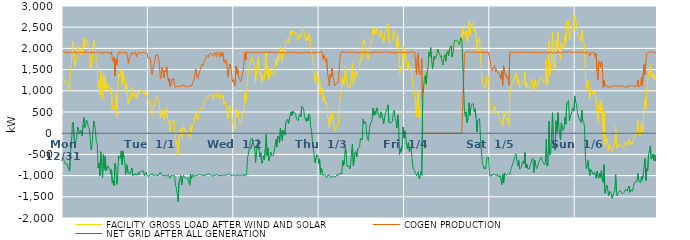
| Category | FACILITY GROSS LOAD AFTER WIND AND SOLAR | COGEN PRODUCTION | NET GRID AFTER ALL GENERATION |
|---|---|---|---|
|  Mon  12/31 | 1329 | 1917 | -588 |
|  Mon  12/31 | 1219 | 1903 | -684 |
|  Mon  12/31 | 1180 | 1905 | -725 |
|  Mon  12/31 | 1200 | 1903 | -703 |
|  Mon  12/31 | 1185 | 1904 | -719 |
|  Mon  12/31 | 1177 | 1906 | -729 |
|  Mon  12/31 | 1044 | 1895 | -851 |
|  Mon  12/31 | 1004 | 1900 | -896 |
|  Mon  12/31 | 1483 | 1908 | -425 |
|  Mon  12/31 | 1666 | 1898 | -232 |
|  Mon  12/31 | 2110 | 1899 | 211 |
|  Mon  12/31 | 2169 | 1907 | 262 |
|  Mon  12/31 | 1770 | 1909 | -139 |
|  Mon  12/31 | 1578 | 1900 | -322 |
|  Mon  12/31 | 1738 | 1912 | -174 |
|  Mon  12/31 | 1782 | 1881 | -99 |
|  Mon  12/31 | 2046 | 1904 | 142 |
|  Mon  12/31 | 1999 | 1904 | 95 |
|  Mon  12/31 | 1878 | 1896 | -18 |
|  Mon  12/31 | 1949 | 1912 | 37 |
|  Mon  12/31 | 1976 | 1906 | 70 |
|  Mon  12/31 | 1841 | 1907 | -66 |
|  Mon  12/31 | 2080 | 1887 | 193 |
|  Mon  12/31 | 2268 | 1894 | 374 |
|  Mon  12/31 | 2028 | 1894 | 134 |
|  Mon  12/31 | 2127 | 1919 | 208 |
|  Mon  12/31 | 2216 | 1905 | 311 |
|  Mon  12/31 | 2159 | 1895 | 264 |
|  Mon  12/31 | 2035 | 1897 | 138 |
|  Mon  12/31 | 2008 | 1903 | 105 |
|  Mon  12/31 | 1819 | 1903 | -84 |
|  Mon  12/31 | 1501 | 1893 | -392 |
|  Mon  12/31 | 1616 | 1907 | -291 |
|  Mon  12/31 | 1901 | 1907 | -6 |
|  Mon  12/31 | 2199 | 1912 | 287 |
|  Mon  12/31 | 2105 | 1898 | 207 |
|  Mon  12/31 | 1959 | 1913 | 46 |
|  Mon  12/31 | 1715 | 1922 | -207 |
|  Mon  12/31 | 1673 | 1907 | -234 |
|  Mon  12/31 | 1083 | 1899 | -816 |
|  Mon  12/31 | 1196 | 1901 | -705 |
|  Mon  12/31 | 888 | 1887 | -999 |
|  Mon  12/31 | 1469 | 1907 | -438 |
|  Mon  12/31 | 1186 | 1915 | -729 |
|  Mon  12/31 | 814 | 1863 | -1049 |
|  Mon  12/31 | 1413 | 1911 | -498 |
|  Mon  12/31 | 1053 | 1905 | -852 |
|  Mon  12/31 | 1358 | 1904 | -546 |
|  Mon  12/31 | 1014 | 1904 | -890 |
|  Mon  12/31 | 994 | 1890 | -896 |
|  Mon  12/31 | 1144 | 1914 | -770 |
|  Mon  12/31 | 1136 | 1912 | -776 |
|  Mon  12/31 | 1025 | 1860 | -835 |
|  Mon  12/31 | 926 | 1890 | -964 |
|  Mon  12/31 | 1075 | 1921 | -846 |
|  Mon  12/31 | 573 | 1751 | -1178 |
|  Mon  12/31 | 572 | 1697 | -1125 |
|  Mon  12/31 | 558 | 1800 | -1242 |
|  Mon  12/31 | 632 | 1350 | -718 |
|  Mon  12/31 | 915 | 1744 | -829 |
|  Mon  12/31 | 399 | 1605 | -1206 |
|  Mon  12/31 | 821 | 1829 | -1008 |
|  Mon  12/31 | 1382 | 1916 | -534 |
|  Mon  12/31 | 1328 | 1892 | -564 |
|  Mon  12/31 | 1313 | 1912 | -599 |
|  Mon  12/31 | 1495 | 1913 | -418 |
|  Mon  12/31 | 1160 | 1899 | -739 |
|  Mon  12/31 | 1472 | 1890 | -418 |
|  Mon  12/31 | 1327 | 1909 | -582 |
|  Mon  12/31 | 1184 | 1903 | -719 |
|  Mon  12/31 | 944 | 1916 | -972 |
|  Mon  12/31 | 1187 | 1913 | -726 |
|  Mon  12/31 | 1193 | 1902 | -709 |
|  Mon  12/31 | 697 | 1645 | -948 |
|  Mon  12/31 | 809 | 1765 | -956 |
|  Mon  12/31 | 783 | 1752 | -969 |
|  Mon  12/31 | 917 | 1864 | -947 |
|  Mon  12/31 | 1078 | 1905 | -827 |
|  Mon  12/31 | 857 | 1856 | -999 |
|  Mon  12/31 | 933 | 1890 | -957 |
|  Mon  12/31 | 881 | 1870 | -989 |
|  Mon  12/31 | 953 | 1908 | -955 |
|  Mon  12/31 | 808 | 1802 | -994 |
|  Mon  12/31 | 891 | 1871 | -980 |
|  Mon  12/31 | 972 | 1901 | -929 |
|  Mon  12/31 | 932 | 1916 | -984 |
|  Mon  12/31 | 982 | 1889 | -907 |
|  Mon  12/31 | 1032 | 1912 | -880 |
|  Mon  12/31 | 1043 | 1901 | -858 |
|  Mon  12/31 | 988 | 1897 | -909 |
|  Mon  12/31 | 1020 | 1901 | -881 |
|  Mon  12/31 | 900 | 1900 | -1000 |
|  Mon  12/31 | 928 | 1893 | -965 |
|  Mon  12/31 | 980 | 1905 | -925 |
|  Mon  12/31 | 886 | 1891 | -1005 |
|  Mon  12/31 | 780 | 1775 | -995 |
|  Tue  1/1 | 761 | 1778 | -1017 |
|  Tue  1/1 | 789 | 1785 | -996 |
|  Tue  1/1 | 765 | 1733 | -968 |
|  Tue  1/1 | 448 | 1412 | -964 |
|  Tue  1/1 | 423 | 1383 | -960 |
|  Tue  1/1 | 561 | 1561 | -1000 |
|  Tue  1/1 | 658 | 1645 | -987 |
|  Tue  1/1 | 748 | 1727 | -979 |
|  Tue  1/1 | 856 | 1850 | -994 |
|  Tue  1/1 | 855 | 1851 | -996 |
|  Tue  1/1 | 848 | 1838 | -990 |
|  Tue  1/1 | 768 | 1762 | -994 |
|  Tue  1/1 | 630 | 1610 | -980 |
|  Tue  1/1 | 360 | 1279 | -919 |
|  Tue  1/1 | 353 | 1331 | -978 |
|  Tue  1/1 | 539 | 1550 | -1011 |
|  Tue  1/1 | 439 | 1451 | -1012 |
|  Tue  1/1 | 318 | 1307 | -989 |
|  Tue  1/1 | 481 | 1479 | -998 |
|  Tue  1/1 | 440 | 1444 | -1004 |
|  Tue  1/1 | 589 | 1573 | -984 |
|  Tue  1/1 | 358 | 1366 | -1008 |
|  Tue  1/1 | 230 | 1212 | -982 |
|  Tue  1/1 | 322 | 1299 | -977 |
|  Tue  1/1 | 38 | 1104 | -1066 |
|  Tue  1/1 | 185 | 1182 | -997 |
|  Tue  1/1 | 281 | 1276 | -995 |
|  Tue  1/1 | 245 | 1248 | -1003 |
|  Tue  1/1 | 316 | 1296 | -980 |
|  Tue  1/1 | 134 | 1135 | -1001 |
|  Tue  1/1 | -154 | 1083 | -1237 |
|  Tue  1/1 | -196 | 1099 | -1295 |
|  Tue  1/1 | -325 | 1107 | -1432 |
|  Tue  1/1 | -514 | 1103 | -1617 |
|  Tue  1/1 | -46 | 1109 | -1155 |
|  Tue  1/1 | 39 | 1113 | -1074 |
|  Tue  1/1 | 113 | 1111 | -998 |
|  Tue  1/1 | -123 | 1099 | -1222 |
|  Tue  1/1 | 55 | 1117 | -1062 |
|  Tue  1/1 | 165 | 1156 | -991 |
|  Tue  1/1 | 63 | 1107 | -1044 |
|  Tue  1/1 | 70 | 1112 | -1042 |
|  Tue  1/1 | 42 | 1109 | -1067 |
|  Tue  1/1 | 40 | 1111 | -1071 |
|  Tue  1/1 | 20 | 1079 | -1059 |
|  Tue  1/1 | -57 | 1095 | -1152 |
|  Tue  1/1 | -108 | 1119 | -1227 |
|  Tue  1/1 | 152 | 1123 | -971 |
|  Tue  1/1 | 43 | 1115 | -1072 |
|  Tue  1/1 | 165 | 1165 | -1000 |
|  Tue  1/1 | 210 | 1181 | -971 |
|  Tue  1/1 | 254 | 1277 | -1023 |
|  Tue  1/1 | 261 | 1282 | -1021 |
|  Tue  1/1 | 517 | 1508 | -991 |
|  Tue  1/1 | 357 | 1352 | -995 |
|  Tue  1/1 | 294 | 1286 | -992 |
|  Tue  1/1 | 370 | 1343 | -973 |
|  Tue  1/1 | 487 | 1459 | -972 |
|  Tue  1/1 | 539 | 1508 | -969 |
|  Tue  1/1 | 617 | 1599 | -982 |
|  Tue  1/1 | 629 | 1625 | -996 |
|  Tue  1/1 | 577 | 1587 | -1010 |
|  Tue  1/1 | 704 | 1685 | -981 |
|  Tue  1/1 | 769 | 1734 | -965 |
|  Tue  1/1 | 767 | 1759 | -992 |
|  Tue  1/1 | 851 | 1838 | -987 |
|  Tue  1/1 | 845 | 1818 | -973 |
|  Tue  1/1 | 853 | 1793 | -940 |
|  Tue  1/1 | 894 | 1869 | -975 |
|  Tue  1/1 | 893 | 1886 | -993 |
|  Tue  1/1 | 899 | 1883 | -984 |
|  Tue  1/1 | 866 | 1853 | -987 |
|  Tue  1/1 | 789 | 1813 | -1024 |
|  Tue  1/1 | 866 | 1849 | -983 |
|  Tue  1/1 | 931 | 1910 | -979 |
|  Tue  1/1 | 919 | 1915 | -996 |
|  Tue  1/1 | 830 | 1802 | -972 |
|  Tue  1/1 | 948 | 1918 | -970 |
|  Tue  1/1 | 881 | 1882 | -1001 |
|  Tue  1/1 | 883 | 1862 | -979 |
|  Tue  1/1 | 797 | 1793 | -996 |
|  Tue  1/1 | 924 | 1902 | -978 |
|  Tue  1/1 | 832 | 1827 | -995 |
|  Tue  1/1 | 903 | 1900 | -997 |
|  Tue  1/1 | 896 | 1887 | -991 |
|  Tue  1/1 | 682 | 1656 | -974 |
|  Tue  1/1 | 681 | 1672 | -991 |
|  Tue  1/1 | 723 | 1723 | -1000 |
|  Tue  1/1 | 567 | 1554 | -987 |
|  Tue  1/1 | 332 | 1336 | -1004 |
|  Tue  1/1 | 547 | 1505 | -958 |
|  Tue  1/1 | 657 | 1631 | -974 |
|  Tue  1/1 | 544 | 1546 | -1002 |
|  Tue  1/1 | 463 | 1469 | -1006 |
|  Tue  1/1 | 228 | 1215 | -987 |
|  Tue  1/1 | 258 | 1261 | -1003 |
|  Wed  1/2 | 184 | 1171 | -987 |
|  Wed  1/2 | 104 | 1117 | -1013 |
|  Wed  1/2 | 576 | 1576 | -1000 |
|  Wed  1/2 | 404 | 1401 | -997 |
|  Wed  1/2 | 529 | 1511 | -982 |
|  Wed  1/2 | 357 | 1335 | -978 |
|  Wed  1/2 | 282 | 1293 | -1011 |
|  Wed  1/2 | 214 | 1214 | -1000 |
|  Wed  1/2 | 264 | 1258 | -994 |
|  Wed  1/2 | 398 | 1379 | -981 |
|  Wed  1/2 | 486 | 1463 | -977 |
|  Wed  1/2 | 630 | 1640 | -1010 |
|  Wed  1/2 | 937 | 1907 | -970 |
|  Wed  1/2 | 727 | 1725 | -998 |
|  Wed  1/2 | 971 | 1914 | -943 |
|  Wed  1/2 | 1314 | 1895 | -581 |
|  Wed  1/2 | 1426 | 1916 | -490 |
|  Wed  1/2 | 1560 | 1896 | -336 |
|  Wed  1/2 | 1704 | 1903 | -199 |
|  Wed  1/2 | 1760 | 1901 | -141 |
|  Wed  1/2 | 1794 | 1906 | -112 |
|  Wed  1/2 | 1746 | 1881 | -135 |
|  Wed  1/2 | 1629 | 1908 | -279 |
|  Wed  1/2 | 1574 | 1895 | -321 |
|  Wed  1/2 | 1201 | 1901 | -700 |
|  Wed  1/2 | 1468 | 1908 | -440 |
|  Wed  1/2 | 1617 | 1905 | -288 |
|  Wed  1/2 | 1784 | 1921 | -137 |
|  Wed  1/2 | 1510 | 1909 | -399 |
|  Wed  1/2 | 1372 | 1929 | -557 |
|  Wed  1/2 | 1423 | 1886 | -463 |
|  Wed  1/2 | 1210 | 1919 | -709 |
|  Wed  1/2 | 1226 | 1908 | -682 |
|  Wed  1/2 | 1370 | 1901 | -531 |
|  Wed  1/2 | 1286 | 1906 | -620 |
|  Wed  1/2 | 1546 | 1912 | -366 |
|  Wed  1/2 | 1886 | 1918 | -32 |
|  Wed  1/2 | 1380 | 1905 | -525 |
|  Wed  1/2 | 1558 | 1908 | -350 |
|  Wed  1/2 | 1255 | 1903 | -648 |
|  Wed  1/2 | 1321 | 1898 | -577 |
|  Wed  1/2 | 1476 | 1920 | -444 |
|  Wed  1/2 | 1396 | 1912 | -516 |
|  Wed  1/2 | 1389 | 1896 | -507 |
|  Wed  1/2 | 1379 | 1904 | -525 |
|  Wed  1/2 | 1464 | 1900 | -436 |
|  Wed  1/2 | 1607 | 1905 | -298 |
|  Wed  1/2 | 1749 | 1895 | -146 |
|  Wed  1/2 | 1584 | 1912 | -328 |
|  Wed  1/2 | 1843 | 1909 | -66 |
|  Wed  1/2 | 1812 | 1920 | -108 |
|  Wed  1/2 | 1685 | 1910 | -225 |
|  Wed  1/2 | 2034 | 1918 | 116 |
|  Wed  1/2 | 1886 | 1904 | -18 |
|  Wed  1/2 | 1713 | 1886 | -173 |
|  Wed  1/2 | 1973 | 1909 | 64 |
|  Wed  1/2 | 1954 | 1902 | 52 |
|  Wed  1/2 | 1858 | 1903 | -45 |
|  Wed  1/2 | 2124 | 1872 | 252 |
|  Wed  1/2 | 2170 | 1911 | 259 |
|  Wed  1/2 | 2229 | 1896 | 333 |
|  Wed  1/2 | 2140 | 1912 | 228 |
|  Wed  1/2 | 2239 | 1913 | 326 |
|  Wed  1/2 | 2247 | 1911 | 336 |
|  Wed  1/2 | 2403 | 1898 | 505 |
|  Wed  1/2 | 2318 | 1897 | 421 |
|  Wed  1/2 | 2425 | 1903 | 522 |
|  Wed  1/2 | 2386 | 1910 | 476 |
|  Wed  1/2 | 2377 | 1892 | 485 |
|  Wed  1/2 | 2370 | 1899 | 471 |
|  Wed  1/2 | 2237 | 1903 | 334 |
|  Wed  1/2 | 2223 | 1894 | 329 |
|  Wed  1/2 | 2201 | 1904 | 297 |
|  Wed  1/2 | 2326 | 1905 | 421 |
|  Wed  1/2 | 2349 | 1903 | 446 |
|  Wed  1/2 | 2277 | 1891 | 386 |
|  Wed  1/2 | 2521 | 1894 | 627 |
|  Wed  1/2 | 2536 | 1906 | 630 |
|  Wed  1/2 | 2470 | 1882 | 588 |
|  Wed  1/2 | 2316 | 1911 | 405 |
|  Wed  1/2 | 2319 | 1918 | 401 |
|  Wed  1/2 | 2184 | 1907 | 277 |
|  Wed  1/2 | 2278 | 1912 | 366 |
|  Wed  1/2 | 2191 | 1903 | 288 |
|  Wed  1/2 | 2354 | 1906 | 448 |
|  Wed  1/2 | 2318 | 1902 | 416 |
|  Wed  1/2 | 2046 | 1900 | 146 |
|  Wed  1/2 | 1939 | 1890 | 49 |
|  Wed  1/2 | 1716 | 1904 | -188 |
|  Wed  1/2 | 1741 | 1908 | -167 |
|  Wed  1/2 | 1367 | 1906 | -539 |
|  Wed  1/2 | 1189 | 1889 | -700 |
|  Wed  1/2 | 1300 | 1887 | -587 |
|  Wed  1/2 | 1415 | 1915 | -500 |
|  Wed  1/2 | 1390 | 1914 | -524 |
|  Wed  1/2 | 1184 | 1899 | -715 |
|  Thu  1/3 | 1302 | 1908 | -606 |
|  Thu  1/3 | 945 | 1914 | -969 |
|  Thu  1/3 | 1084 | 1909 | -825 |
|  Thu  1/3 | 1027 | 1913 | -886 |
|  Thu  1/3 | 751 | 1749 | -998 |
|  Thu  1/3 | 864 | 1834 | -970 |
|  Thu  1/3 | 780 | 1743 | -963 |
|  Thu  1/3 | 676 | 1680 | -1004 |
|  Thu  1/3 | 716 | 1762 | -1046 |
|  Thu  1/3 | 412 | 1406 | -994 |
|  Thu  1/3 | 320 | 1293 | -973 |
|  Thu  1/3 | 135 | 1120 | -985 |
|  Thu  1/3 | 425 | 1388 | -963 |
|  Thu  1/3 | 278 | 1321 | -1043 |
|  Thu  1/3 | 504 | 1532 | -1028 |
|  Thu  1/3 | 364 | 1368 | -1004 |
|  Thu  1/3 | 238 | 1237 | -999 |
|  Thu  1/3 | 80 | 1115 | -1035 |
|  Thu  1/3 | 52 | 1106 | -1054 |
|  Thu  1/3 | 173 | 1182 | -1009 |
|  Thu  1/3 | 196 | 1166 | -970 |
|  Thu  1/3 | 186 | 1185 | -999 |
|  Thu  1/3 | 499 | 1475 | -976 |
|  Thu  1/3 | 825 | 1770 | -945 |
|  Thu  1/3 | 941 | 1898 | -957 |
|  Thu  1/3 | 935 | 1892 | -957 |
|  Thu  1/3 | 1296 | 1925 | -629 |
|  Thu  1/3 | 1141 | 1908 | -767 |
|  Thu  1/3 | 1247 | 1912 | -665 |
|  Thu  1/3 | 1586 | 1902 | -316 |
|  Thu  1/3 | 1409 | 1895 | -486 |
|  Thu  1/3 | 1115 | 1897 | -782 |
|  Thu  1/3 | 1146 | 1917 | -771 |
|  Thu  1/3 | 1151 | 1918 | -767 |
|  Thu  1/3 | 1064 | 1907 | -843 |
|  Thu  1/3 | 1149 | 1901 | -752 |
|  Thu  1/3 | 1464 | 1905 | -441 |
|  Thu  1/3 | 1657 | 1911 | -254 |
|  Thu  1/3 | 1145 | 1914 | -769 |
|  Thu  1/3 | 1124 | 1904 | -780 |
|  Thu  1/3 | 1449 | 1905 | -456 |
|  Thu  1/3 | 1470 | 1900 | -430 |
|  Thu  1/3 | 1344 | 1901 | -557 |
|  Thu  1/3 | 1524 | 1893 | -369 |
|  Thu  1/3 | 1513 | 1893 | -380 |
|  Thu  1/3 | 1566 | 1886 | -320 |
|  Thu  1/3 | 1793 | 1910 | -117 |
|  Thu  1/3 | 1800 | 1897 | -97 |
|  Thu  1/3 | 1745 | 1907 | -162 |
|  Thu  1/3 | 2224 | 1891 | 333 |
|  Thu  1/3 | 2125 | 1900 | 225 |
|  Thu  1/3 | 2176 | 1900 | 276 |
|  Thu  1/3 | 2164 | 1919 | 245 |
|  Thu  1/3 | 1880 | 1902 | -22 |
|  Thu  1/3 | 1769 | 1903 | -134 |
|  Thu  1/3 | 1734 | 1908 | -174 |
|  Thu  1/3 | 1988 | 1910 | 78 |
|  Thu  1/3 | 2094 | 1877 | 217 |
|  Thu  1/3 | 2125 | 1893 | 232 |
|  Thu  1/3 | 2213 | 1911 | 302 |
|  Thu  1/3 | 2487 | 1894 | 593 |
|  Thu  1/3 | 2329 | 1909 | 420 |
|  Thu  1/3 | 2433 | 1920 | 513 |
|  Thu  1/3 | 2348 | 1907 | 441 |
|  Thu  1/3 | 2470 | 1896 | 574 |
|  Thu  1/3 | 2503 | 1899 | 604 |
|  Thu  1/3 | 2341 | 1912 | 429 |
|  Thu  1/3 | 2311 | 1914 | 397 |
|  Thu  1/3 | 2261 | 1907 | 354 |
|  Thu  1/3 | 2416 | 1912 | 504 |
|  Thu  1/3 | 2395 | 1905 | 490 |
|  Thu  1/3 | 2257 | 1910 | 347 |
|  Thu  1/3 | 2131 | 1914 | 217 |
|  Thu  1/3 | 2283 | 1911 | 372 |
|  Thu  1/3 | 2391 | 1922 | 469 |
|  Thu  1/3 | 2406 | 1920 | 486 |
|  Thu  1/3 | 2497 | 1910 | 587 |
|  Thu  1/3 | 2577 | 1910 | 667 |
|  Thu  1/3 | 2154 | 1898 | 256 |
|  Thu  1/3 | 2157 | 1893 | 264 |
|  Thu  1/3 | 2153 | 1912 | 241 |
|  Thu  1/3 | 2147 | 1915 | 232 |
|  Thu  1/3 | 2189 | 1907 | 282 |
|  Thu  1/3 | 2393 | 1899 | 494 |
|  Thu  1/3 | 2430 | 1893 | 537 |
|  Thu  1/3 | 2257 | 1900 | 357 |
|  Thu  1/3 | 2201 | 1907 | 294 |
|  Thu  1/3 | 2013 | 1892 | 121 |
|  Thu  1/3 | 2323 | 1893 | 430 |
|  Thu  1/3 | 2080 | 1909 | 171 |
|  Thu  1/3 | 1400 | 1900 | -500 |
|  Thu  1/3 | 1554 | 1913 | -359 |
|  Thu  1/3 | 1469 | 1918 | -449 |
|  Thu  1/3 | 1609 | 1899 | -290 |
|  Thu  1/3 | 2049 | 1902 | 147 |
|  Thu  1/3 | 1788 | 1905 | -117 |
|  Fri  1/4 | 1962 | 1906 | 56 |
|  Fri  1/4 | 1784 | 1910 | -126 |
|  Fri  1/4 | 1611 | 1905 | -294 |
|  Fri  1/4 | 1525 | 1893 | -368 |
|  Fri  1/4 | 1679 | 1888 | -209 |
|  Fri  1/4 | 1472 | 1908 | -436 |
|  Fri  1/4 | 1495 | 1920 | -425 |
|  Fri  1/4 | 1561 | 1912 | -351 |
|  Fri  1/4 | 1333 | 1908 | -575 |
|  Fri  1/4 | 1111 | 1920 | -809 |
|  Fri  1/4 | 1064 | 1914 | -850 |
|  Fri  1/4 | 1084 | 1912 | -828 |
|  Fri  1/4 | 712 | 1664 | -952 |
|  Fri  1/4 | 379 | 1379 | -1000 |
|  Fri  1/4 | 790 | 1783 | -993 |
|  Fri  1/4 | 975 | 1886 | -911 |
|  Fri  1/4 | 356 | 1430 | -1074 |
|  Fri  1/4 | 362 | 1373 | -1011 |
|  Fri  1/4 | 494 | 1398 | -904 |
|  Fri  1/4 | 772 | 1763 | -991 |
|  Fri  1/4 | 834 | 0 | 834 |
|  Fri  1/4 | 847 | 0 | 847 |
|  Fri  1/4 | 1290 | 0 | 1290 |
|  Fri  1/4 | 1366 | 0 | 1366 |
|  Fri  1/4 | 1155 | 0 | 1155 |
|  Fri  1/4 | 1454 | 0 | 1454 |
|  Fri  1/4 | 1541 | 0 | 1541 |
|  Fri  1/4 | 1907 | 0 | 1907 |
|  Fri  1/4 | 1812 | 0 | 1812 |
|  Fri  1/4 | 2020 | 0 | 2020 |
|  Fri  1/4 | 1741 | 0 | 1741 |
|  Fri  1/4 | 1524 | 0 | 1524 |
|  Fri  1/4 | 1526 | 0 | 1526 |
|  Fri  1/4 | 1817 | 0 | 1817 |
|  Fri  1/4 | 1756 | 0 | 1756 |
|  Fri  1/4 | 1783 | 0 | 1783 |
|  Fri  1/4 | 1863 | 0 | 1863 |
|  Fri  1/4 | 1980 | 0 | 1980 |
|  Fri  1/4 | 1906 | 0 | 1906 |
|  Fri  1/4 | 1871 | 0 | 1871 |
|  Fri  1/4 | 1792 | 0 | 1792 |
|  Fri  1/4 | 1830 | 0 | 1830 |
|  Fri  1/4 | 1648 | 0 | 1648 |
|  Fri  1/4 | 1605 | 0 | 1605 |
|  Fri  1/4 | 1791 | 0 | 1791 |
|  Fri  1/4 | 1850 | 0 | 1850 |
|  Fri  1/4 | 1697 | 0 | 1697 |
|  Fri  1/4 | 1892 | 0 | 1892 |
|  Fri  1/4 | 1943 | 0 | 1943 |
|  Fri  1/4 | 1822 | 0 | 1822 |
|  Fri  1/4 | 1975 | 0 | 1975 |
|  Fri  1/4 | 1973 | 0 | 1973 |
|  Fri  1/4 | 2065 | 0 | 2065 |
|  Fri  1/4 | 1801 | 0 | 1801 |
|  Fri  1/4 | 1878 | 0 | 1878 |
|  Fri  1/4 | 2082 | 0 | 2082 |
|  Fri  1/4 | 2194 | 0 | 2194 |
|  Fri  1/4 | 2179 | 0 | 2179 |
|  Fri  1/4 | 2191 | 0 | 2191 |
|  Fri  1/4 | 2190 | 0 | 2190 |
|  Fri  1/4 | 2158 | 0 | 2158 |
|  Fri  1/4 | 2084 | 0 | 2084 |
|  Fri  1/4 | 2152 | 0 | 2152 |
|  Fri  1/4 | 2253 | 0 | 2253 |
|  Fri  1/4 | 2186 | 0 | 2186 |
|  Fri  1/4 | 2469 | 770 | 1699 |
|  Fri  1/4 | 2320 | 1240 | 1080 |
|  Fri  1/4 | 2391 | 1875 | 516 |
|  Fri  1/4 | 2308 | 1909 | 399 |
|  Fri  1/4 | 2413 | 1906 | 507 |
|  Fri  1/4 | 2159 | 1913 | 246 |
|  Fri  1/4 | 2274 | 1917 | 357 |
|  Fri  1/4 | 2642 | 1923 | 719 |
|  Fri  1/4 | 2320 | 1906 | 414 |
|  Fri  1/4 | 2480 | 1898 | 582 |
|  Fri  1/4 | 2582 | 1898 | 684 |
|  Fri  1/4 | 2610 | 1907 | 703 |
|  Fri  1/4 | 2602 | 1908 | 694 |
|  Fri  1/4 | 2398 | 1901 | 497 |
|  Fri  1/4 | 2479 | 1904 | 575 |
|  Fri  1/4 | 2284 | 1918 | 366 |
|  Fri  1/4 | 1937 | 1911 | 26 |
|  Fri  1/4 | 2204 | 1904 | 300 |
|  Fri  1/4 | 2201 | 1901 | 300 |
|  Fri  1/4 | 2255 | 1909 | 346 |
|  Fri  1/4 | 1801 | 1918 | -117 |
|  Fri  1/4 | 1807 | 1908 | -101 |
|  Fri  1/4 | 1221 | 1921 | -700 |
|  Fri  1/4 | 1143 | 1902 | -759 |
|  Fri  1/4 | 1070 | 1910 | -840 |
|  Fri  1/4 | 1099 | 1905 | -806 |
|  Fri  1/4 | 1063 | 1904 | -841 |
|  Fri  1/4 | 1318 | 1899 | -581 |
|  Fri  1/4 | 1308 | 1908 | -600 |
|  Fri  1/4 | 1352 | 1913 | -561 |
|  Fri  1/4 | 954 | 1901 | -947 |
|  Sat  1/5 | 673 | 1696 | -1023 |
|  Sat  1/5 | 552 | 1525 | -973 |
|  Sat  1/5 | 460 | 1463 | -1003 |
|  Sat  1/5 | 498 | 1471 | -973 |
|  Sat  1/5 | 558 | 1554 | -996 |
|  Sat  1/5 | 630 | 1599 | -969 |
|  Sat  1/5 | 467 | 1447 | -980 |
|  Sat  1/5 | 494 | 1507 | -1013 |
|  Sat  1/5 | 473 | 1434 | -961 |
|  Sat  1/5 | 431 | 1434 | -1003 |
|  Sat  1/5 | 386 | 1420 | -1034 |
|  Sat  1/5 | 338 | 1330 | -992 |
|  Sat  1/5 | 266 | 1275 | -1009 |
|  Sat  1/5 | 256 | 1471 | -1215 |
|  Sat  1/5 | 167 | 1129 | -962 |
|  Sat  1/5 | 416 | 1591 | -1175 |
|  Sat  1/5 | 524 | 1461 | -937 |
|  Sat  1/5 | 380 | 1352 | -972 |
|  Sat  1/5 | 387 | 1383 | -996 |
|  Sat  1/5 | 305 | 1289 | -984 |
|  Sat  1/5 | 359 | 1321 | -962 |
|  Sat  1/5 | 168 | 1134 | -966 |
|  Sat  1/5 | 939 | 1900 | -961 |
|  Sat  1/5 | 1055 | 1918 | -863 |
|  Sat  1/5 | 1128 | 1926 | -798 |
|  Sat  1/5 | 1149 | 1901 | -752 |
|  Sat  1/5 | 1231 | 1913 | -682 |
|  Sat  1/5 | 1298 | 1903 | -605 |
|  Sat  1/5 | 1370 | 1902 | -532 |
|  Sat  1/5 | 1423 | 1910 | -487 |
|  Sat  1/5 | 1236 | 1897 | -661 |
|  Sat  1/5 | 1140 | 1910 | -770 |
|  Sat  1/5 | 1265 | 1910 | -645 |
|  Sat  1/5 | 1058 | 1901 | -843 |
|  Sat  1/5 | 1060 | 1897 | -837 |
|  Sat  1/5 | 1097 | 1910 | -813 |
|  Sat  1/5 | 1227 | 1916 | -689 |
|  Sat  1/5 | 1245 | 1899 | -654 |
|  Sat  1/5 | 1177 | 1900 | -723 |
|  Sat  1/5 | 1449 | 1907 | -458 |
|  Sat  1/5 | 1082 | 1901 | -819 |
|  Sat  1/5 | 1188 | 1918 | -730 |
|  Sat  1/5 | 1078 | 1906 | -828 |
|  Sat  1/5 | 1089 | 1906 | -817 |
|  Sat  1/5 | 1060 | 1897 | -837 |
|  Sat  1/5 | 1148 | 1898 | -750 |
|  Sat  1/5 | 1232 | 1927 | -695 |
|  Sat  1/5 | 1282 | 1896 | -614 |
|  Sat  1/5 | 1302 | 1890 | -588 |
|  Sat  1/5 | 977 | 1904 | -927 |
|  Sat  1/5 | 1263 | 1896 | -633 |
|  Sat  1/5 | 1165 | 1909 | -744 |
|  Sat  1/5 | 1098 | 1931 | -833 |
|  Sat  1/5 | 1092 | 1897 | -805 |
|  Sat  1/5 | 1173 | 1898 | -725 |
|  Sat  1/5 | 1252 | 1912 | -660 |
|  Sat  1/5 | 1252 | 1919 | -667 |
|  Sat  1/5 | 1328 | 1897 | -569 |
|  Sat  1/5 | 1298 | 1907 | -609 |
|  Sat  1/5 | 1241 | 1908 | -667 |
|  Sat  1/5 | 1208 | 1898 | -690 |
|  Sat  1/5 | 1167 | 1915 | -748 |
|  Sat  1/5 | 1216 | 1910 | -694 |
|  Sat  1/5 | 1750 | 1895 | -145 |
|  Sat  1/5 | 1128 | 1907 | -779 |
|  Sat  1/5 | 1192 | 1919 | -727 |
|  Sat  1/5 | 2175 | 1889 | 286 |
|  Sat  1/5 | 1381 | 1890 | -509 |
|  Sat  1/5 | 1471 | 1921 | -450 |
|  Sat  1/5 | 1907 | 1911 | -4 |
|  Sat  1/5 | 2376 | 1894 | 482 |
|  Sat  1/5 | 1578 | 1904 | -326 |
|  Sat  1/5 | 1659 | 1894 | -235 |
|  Sat  1/5 | 1501 | 1901 | -400 |
|  Sat  1/5 | 2180 | 1888 | 292 |
|  Sat  1/5 | 1941 | 1923 | 18 |
|  Sat  1/5 | 2386 | 1902 | 484 |
|  Sat  1/5 | 2099 | 1917 | 182 |
|  Sat  1/5 | 1898 | 1923 | -25 |
|  Sat  1/5 | 1739 | 1897 | -158 |
|  Sat  1/5 | 2145 | 1901 | 244 |
|  Sat  1/5 | 2024 | 1897 | 127 |
|  Sat  1/5 | 1980 | 1911 | 69 |
|  Sat  1/5 | 2030 | 1921 | 109 |
|  Sat  1/5 | 2303 | 1923 | 380 |
|  Sat  1/5 | 2136 | 1922 | 214 |
|  Sat  1/5 | 2620 | 1909 | 711 |
|  Sat  1/5 | 2600 | 1911 | 689 |
|  Sat  1/5 | 2676 | 1902 | 774 |
|  Sat  1/5 | 2214 | 1926 | 288 |
|  Sat  1/5 | 2319 | 1908 | 411 |
|  Sat  1/5 | 2354 | 1905 | 449 |
|  Sat  1/5 | 2460 | 1911 | 549 |
|  Sat  1/5 | 2496 | 1901 | 595 |
|  Sat  1/5 | 2420 | 1902 | 518 |
|  Sat  1/5 | 2790 | 1916 | 874 |
|  Sun  1/6 | 2629 | 1894 | 735 |
|  Sun  1/6 | 2598 | 1909 | 689 |
|  Sun  1/6 | 2402 | 1907 | 495 |
|  Sun  1/6 | 2293 | 1909 | 384 |
|  Sun  1/6 | 2238 | 1886 | 352 |
|  Sun  1/6 | 2248 | 1911 | 337 |
|  Sun  1/6 | 2152 | 1897 | 255 |
|  Sun  1/6 | 2439 | 1899 | 540 |
|  Sun  1/6 | 2189 | 1905 | 284 |
|  Sun  1/6 | 2164 | 1906 | 258 |
|  Sun  1/6 | 2063 | 1900 | 163 |
|  Sun  1/6 | 1326 | 1892 | -566 |
|  Sun  1/6 | 1062 | 1906 | -844 |
|  Sun  1/6 | 1151 | 1918 | -767 |
|  Sun  1/6 | 1257 | 1901 | -644 |
|  Sun  1/6 | 989 | 1881 | -892 |
|  Sun  1/6 | 818 | 1815 | -997 |
|  Sun  1/6 | 1046 | 1899 | -853 |
|  Sun  1/6 | 1013 | 1907 | -894 |
|  Sun  1/6 | 990 | 1906 | -916 |
|  Sun  1/6 | 923 | 1906 | -983 |
|  Sun  1/6 | 973 | 1894 | -921 |
|  Sun  1/6 | 878 | 1804 | -926 |
|  Sun  1/6 | 817 | 1877 | -1060 |
|  Sun  1/6 | 541 | 1441 | -900 |
|  Sun  1/6 | 262 | 1262 | -1000 |
|  Sun  1/6 | 632 | 1691 | -1059 |
|  Sun  1/6 | 721 | 1666 | -945 |
|  Sun  1/6 | 507 | 1545 | -1038 |
|  Sun  1/6 | 812 | 1691 | -879 |
|  Sun  1/6 | 474 | 1573 | -1099 |
|  Sun  1/6 | -85 | 1076 | -1161 |
|  Sun  1/6 | 514 | 1255 | -741 |
|  Sun  1/6 | -303 | 1111 | -1414 |
|  Sun  1/6 | -232 | 1103 | -1335 |
|  Sun  1/6 | -116 | 1109 | -1225 |
|  Sun  1/6 | -193 | 1113 | -1306 |
|  Sun  1/6 | -409 | 1073 | -1482 |
|  Sun  1/6 | -260 | 1112 | -1372 |
|  Sun  1/6 | -253 | 1114 | -1367 |
|  Sun  1/6 | -342 | 1079 | -1421 |
|  Sun  1/6 | -422 | 1113 | -1535 |
|  Sun  1/6 | -356 | 1115 | -1471 |
|  Sun  1/6 | -310 | 1097 | -1407 |
|  Sun  1/6 | -239 | 1116 | -1355 |
|  Sun  1/6 | 156 | 1136 | -980 |
|  Sun  1/6 | -320 | 1092 | -1412 |
|  Sun  1/6 | -358 | 1124 | -1482 |
|  Sun  1/6 | -296 | 1106 | -1402 |
|  Sun  1/6 | -274 | 1121 | -1395 |
|  Sun  1/6 | -261 | 1090 | -1351 |
|  Sun  1/6 | -297 | 1099 | -1396 |
|  Sun  1/6 | -299 | 1116 | -1415 |
|  Sun  1/6 | -315 | 1113 | -1428 |
|  Sun  1/6 | -318 | 1105 | -1423 |
|  Sun  1/6 | -309 | 1077 | -1386 |
|  Sun  1/6 | -237 | 1093 | -1330 |
|  Sun  1/6 | -202 | 1110 | -1312 |
|  Sun  1/6 | -288 | 1073 | -1361 |
|  Sun  1/6 | -266 | 1112 | -1378 |
|  Sun  1/6 | -146 | 1101 | -1247 |
|  Sun  1/6 | -279 | 1113 | -1392 |
|  Sun  1/6 | -219 | 1120 | -1339 |
|  Sun  1/6 | -220 | 1120 | -1340 |
|  Sun  1/6 | -248 | 1119 | -1367 |
|  Sun  1/6 | -148 | 1112 | -1260 |
|  Sun  1/6 | -80 | 1101 | -1181 |
|  Sun  1/6 | -42 | 1111 | -1153 |
|  Sun  1/6 | -53 | 1090 | -1143 |
|  Sun  1/6 | -20 | 1115 | -1135 |
|  Sun  1/6 | 309 | 1262 | -953 |
|  Sun  1/6 | -32 | 1092 | -1124 |
|  Sun  1/6 | -36 | 1102 | -1138 |
|  Sun  1/6 | -48 | 1126 | -1174 |
|  Sun  1/6 | 293 | 1312 | -1019 |
|  Sun  1/6 | 10 | 1124 | -1114 |
|  Sun  1/6 | 131 | 1114 | -983 |
|  Sun  1/6 | 641 | 1616 | -975 |
|  Sun  1/6 | 776 | 1374 | -598 |
|  Sun  1/6 | 573 | 1687 | -1114 |
|  Sun  1/6 | 1049 | 1888 | -839 |
|  Sun  1/6 | 1026 | 1909 | -883 |
|  Sun  1/6 | 1411 | 1909 | -498 |
|  Sun  1/6 | 1474 | 1891 | -417 |
|  Sun  1/6 | 1614 | 1911 | -297 |
|  Sun  1/6 | 1307 | 1919 | -612 |
|  Sun  1/6 | 1338 | 1920 | -582 |
|  Sun  1/6 | 1413 | 1905 | -492 |
|  Sun  1/6 | 1263 | 1910 | -647 |
|  Sun  1/6 | 1375 | 1883 | -508 |
|  Sun  1/6 | 1247 | 1905 | -658 |
|  Sun  1/6 | 1333 | 1908 | -575 |